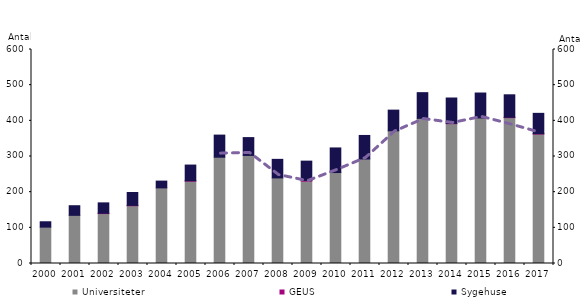
| Category | Universiteter | GEUS | Sygehuse |
|---|---|---|---|
| 2000.0 | 102 | 0 | 15 |
| 2001.0 | 135 | 0 | 27 |
| 2002.0 | 140 | 1 | 29 |
| 2003.0 | 162 | 1 | 36 |
| 2004.0 | 212 | 0 | 19 |
| 2005.0 | 231 | 1 | 44 |
| 2006.0 | 298 | 0 | 62 |
| 2007.0 | 303 | 0 | 50 |
| 2008.0 | 240 | 0 | 52 |
| 2009.0 | 231 | 2 | 54 |
| 2010.0 | 255 | 0 | 69 |
| 2011.0 | 293 | 0 | 66 |
| 2012.0 | 372 | 0 | 58 |
| 2013.0 | 407 | 0 | 72 |
| 2014.0 | 392 | 1 | 71 |
| 2015.0 | 408 | 0 | 70 |
| 2016.0 | 409 | 1 | 63 |
| 2017.0 | 363 | 1 | 57 |